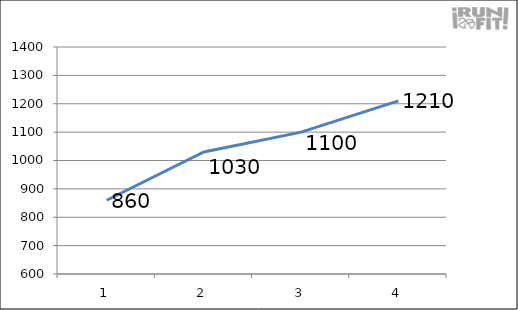
| Category | Series 0 |
|---|---|
| 0 | 860 |
| 1 | 1030 |
| 2 | 1100 |
| 3 | 1210 |